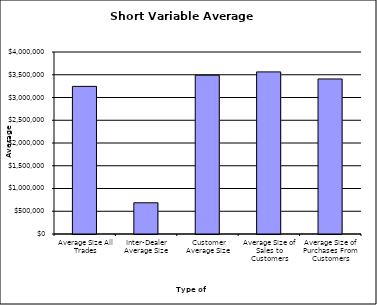
| Category | Security Type |
|---|---|
| Average Size All Trades | 3244405.199 |
| Inter-Dealer Average Size | 685871.829 |
| Customer Average Size | 3489719.839 |
| Average Size of Sales to Customers | 3562542.206 |
| Average Size of Purchases From Customers | 3407306.122 |